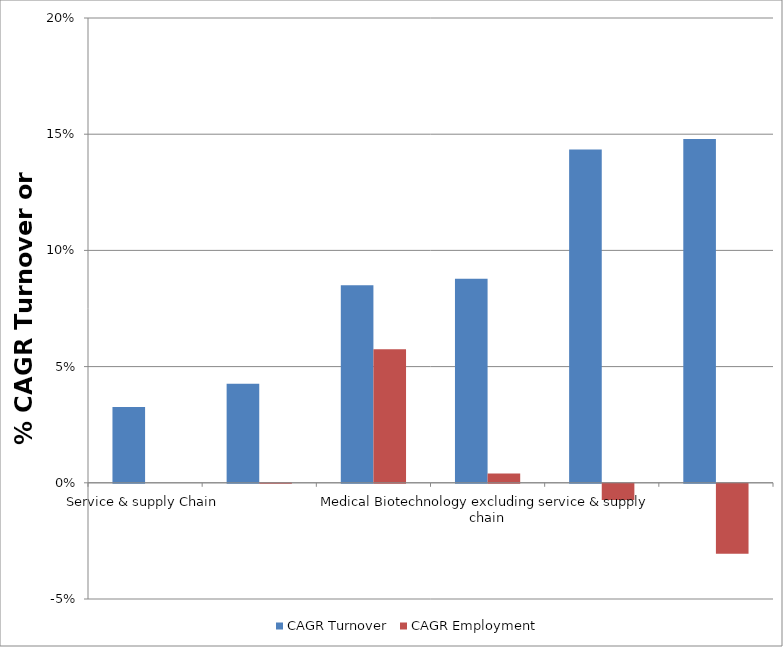
| Category | CAGR Turnover | CAGR Employment |
|---|---|---|
| Service & supply Chain | 0.033 | 0 |
| Medical Biotechology | 0.043 | 0 |
| Advanced Therapy Medicinal Products | 0.085 | 0.057 |
| Medical Biotechnology excluding service & supply chain | 0.088 | 0.004 |
| Small Molecules | 0.143 | -0.007 |
| Therapeutic proteins | 0.148 | -0.03 |